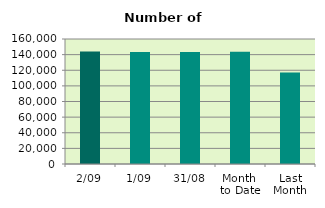
| Category | Series 0 |
|---|---|
| 2/09 | 143896 |
| 1/09 | 143484 |
| 31/08 | 143496 |
| Month 
to Date | 143690 |
| Last
Month | 117090.273 |